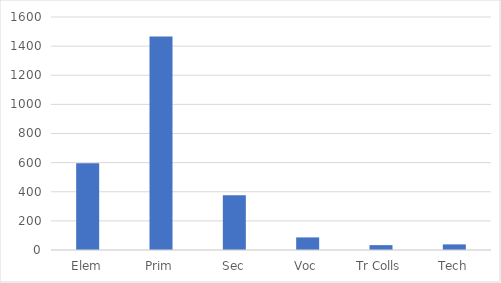
| Category | Series 0 |
|---|---|
| Elem | 596.535 |
| Prim | 1465.561 |
| Sec | 375.432 |
| Voc | 86.412 |
| Tr Colls | 33.386 |
| Tech | 38.542 |